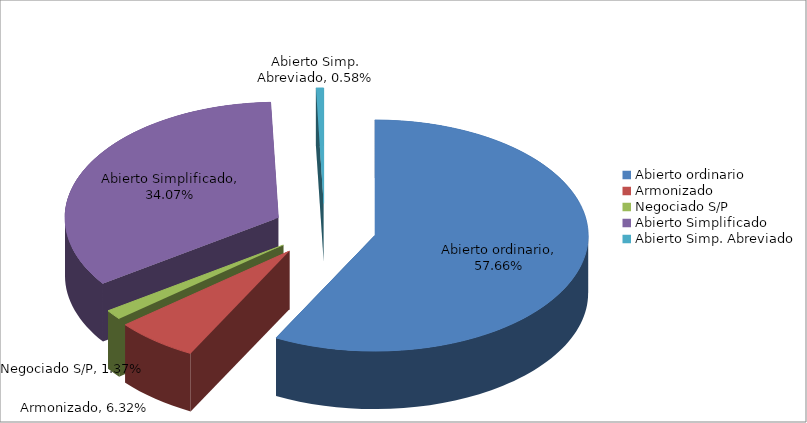
| Category | Series 0 |
|---|---|
| Abierto ordinario | 0.577 |
| Armonizado | 0.063 |
| Negociado S/P | 0.014 |
| Abierto Simplificado | 0.341 |
| Abierto Simp. Abreviado | 0.006 |